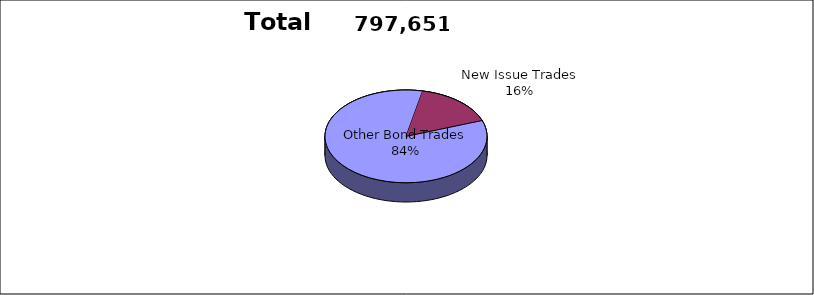
| Category | Series 0 |
|---|---|
| Other Bond Trades | 668736 |
| New Issue Trades | 128915 |